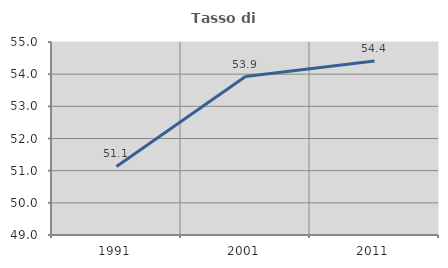
| Category | Tasso di occupazione   |
|---|---|
| 1991.0 | 51.132 |
| 2001.0 | 53.925 |
| 2011.0 | 54.409 |